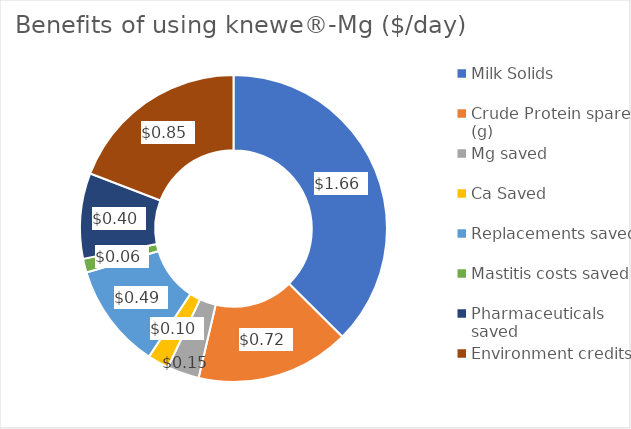
| Category | Benefits |
|---|---|
| Milk Solids  | 1.664 |
| Crude Protein spared (g) | 0.72 |
| Mg saved | 0.15 |
| Ca Saved | 0.1 |
| Replacements saved | 0.493 |
| Mastitis costs saved | 0.065 |
| Pharmaceuticals saved | 0.4 |
| Environment credits | 0.852 |